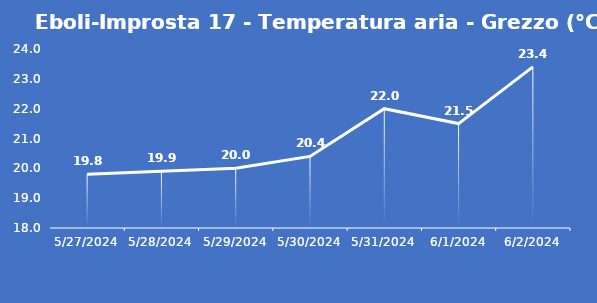
| Category | Eboli-Improsta 17 - Temperatura aria - Grezzo (°C) |
|---|---|
| 5/27/24 | 19.8 |
| 5/28/24 | 19.9 |
| 5/29/24 | 20 |
| 5/30/24 | 20.4 |
| 5/31/24 | 22 |
| 6/1/24 | 21.5 |
| 6/2/24 | 23.4 |